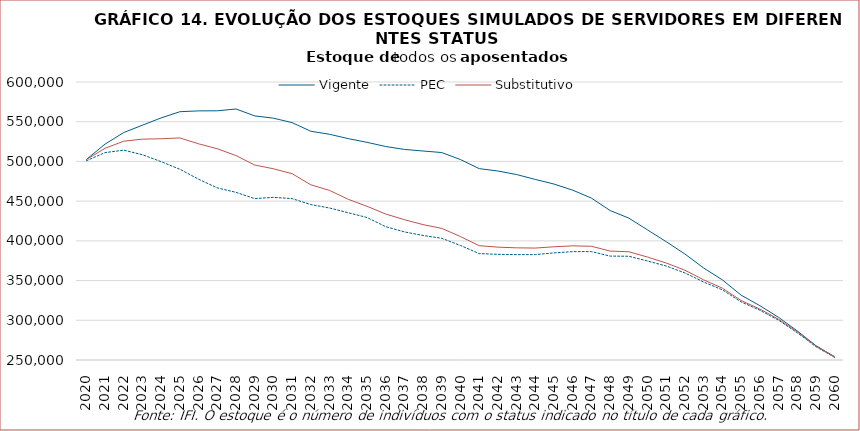
| Category | Vigente | PEC | Substitutivo |
|---|---|---|---|
| 2020.0 | 502427 | 500810 | 502333 |
| 2021.0 | 521773 | 511119 | 516582 |
| 2022.0 | 536437 | 514214 | 525466 |
| 2023.0 | 545651 | 508382 | 528066 |
| 2024.0 | 554823 | 499704 | 528527 |
| 2025.0 | 562588 | 490123 | 529576 |
| 2026.0 | 563639 | 477577 | 522177 |
| 2027.0 | 563757 | 466706 | 515946 |
| 2028.0 | 566009 | 461046 | 507380 |
| 2029.0 | 557315 | 453162 | 495441 |
| 2030.0 | 554464 | 454780 | 490779 |
| 2031.0 | 548829 | 453182 | 484563 |
| 2032.0 | 537981 | 445655 | 470571 |
| 2033.0 | 534187 | 441362 | 463492 |
| 2034.0 | 528693 | 435367 | 452316 |
| 2035.0 | 524058 | 429423 | 443536 |
| 2036.0 | 518777 | 417863 | 433791 |
| 2037.0 | 515121 | 411278 | 426681 |
| 2038.0 | 513113 | 406773 | 420442 |
| 2039.0 | 511169 | 403213 | 415679 |
| 2040.0 | 502323 | 394196 | 405361 |
| 2041.0 | 490933 | 383985 | 393934 |
| 2042.0 | 487947 | 383028 | 392079 |
| 2043.0 | 483473 | 382649 | 391210 |
| 2044.0 | 477334 | 382691 | 390913 |
| 2045.0 | 471509 | 384835 | 392542 |
| 2046.0 | 463815 | 386448 | 393715 |
| 2047.0 | 453782 | 386445 | 393189 |
| 2048.0 | 438172 | 380816 | 387128 |
| 2049.0 | 428628 | 380607 | 386261 |
| 2050.0 | 413766 | 374658 | 379589 |
| 2051.0 | 398908 | 368302 | 372077 |
| 2052.0 | 383388 | 359585 | 363012 |
| 2053.0 | 365789 | 348175 | 350888 |
| 2054.0 | 350855 | 338293 | 340433 |
| 2055.0 | 331666 | 323113 | 324843 |
| 2056.0 | 318406 | 312686 | 314185 |
| 2057.0 | 303750 | 300091 | 301374 |
| 2058.0 | 286632 | 284349 | 285435 |
| 2059.0 | 268075 | 266749 | 267543 |
| 2060.0 | 254019 | 253267 | 253796 |